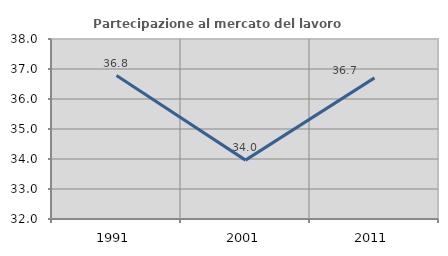
| Category | Partecipazione al mercato del lavoro  femminile |
|---|---|
| 1991.0 | 36.783 |
| 2001.0 | 33.963 |
| 2011.0 | 36.704 |